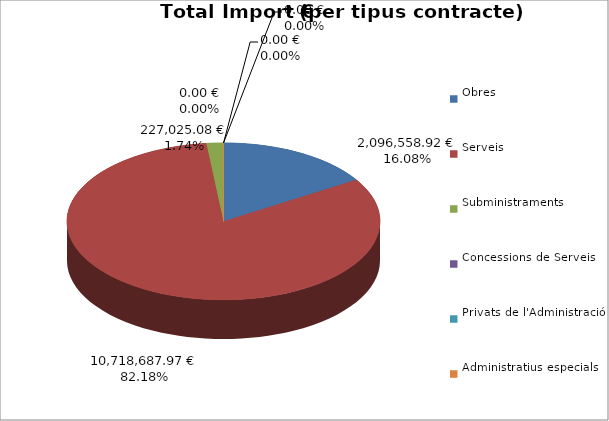
| Category | Total preu
(amb IVA) |
|---|---|
| Obres | 2096558.925 |
| Serveis | 10718687.972 |
| Subministraments | 227025.079 |
| Concessions de Serveis | 0 |
| Privats de l'Administració | 0 |
| Administratius especials | 0 |